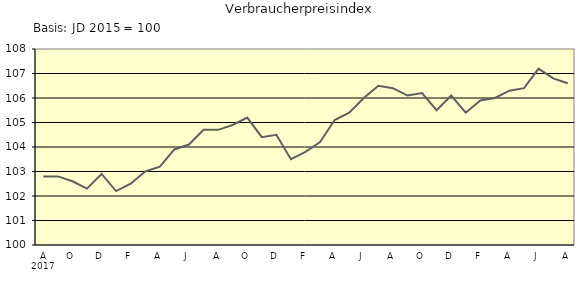
| Category | Series 0 |
|---|---|
| 0 | 102.8 |
| 1 | 102.8 |
| 2 | 102.6 |
| 3 | 102.3 |
| 4 | 102.9 |
| 5 | 102.2 |
| 6 | 102.5 |
| 7 | 103 |
| 8 | 103.2 |
| 9 | 103.9 |
| 10 | 104.1 |
| 11 | 104.7 |
| 12 | 104.7 |
| 13 | 104.9 |
| 14 | 105.2 |
| 15 | 104.4 |
| 16 | 104.5 |
| 17 | 103.5 |
| 18 | 103.8 |
| 19 | 104.2 |
| 20 | 105.1 |
| 21 | 105.4 |
| 22 | 106 |
| 23 | 106.5 |
| 24 | 106.4 |
| 25 | 106.1 |
| 26 | 106.2 |
| 27 | 105.5 |
| 28 | 106.1 |
| 29 | 105.4 |
| 30 | 105.9 |
| 31 | 106 |
| 32 | 106.3 |
| 33 | 106.4 |
| 34 | 107.2 |
| 35 | 106.8 |
| 36 | 106.6 |